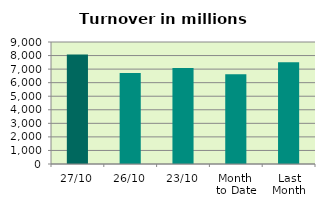
| Category | Series 0 |
|---|---|
| 27/10 | 8080.384 |
| 26/10 | 6721.491 |
| 23/10 | 7074.551 |
| Month 
to Date | 6620.026 |
| Last
Month | 7507.246 |